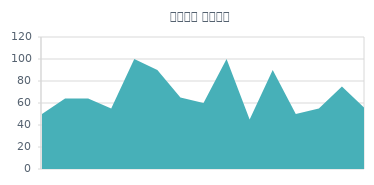
| Category | पानी आउंस. |
|---|---|
| 0 | 50 |
| 1 | 64 |
| 2 | 64 |
| 3 | 55 |
| 4 | 100 |
| 5 | 90 |
| 6 | 65 |
| 7 | 60 |
| 8 | 100 |
| 9 | 45 |
| 10 | 90 |
| 11 | 50 |
| 12 | 55 |
| 13 | 75 |
| 14 | 55 |